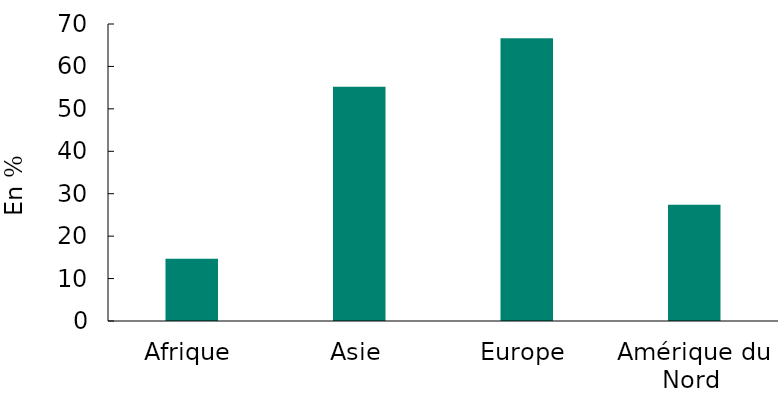
| Category | Part du commerce intra-régional  |
|---|---|
| Afrique | 14.655 |
| Asie | 55.193 |
| Europe | 66.648 |
| Amérique du Nord  | 27.392 |